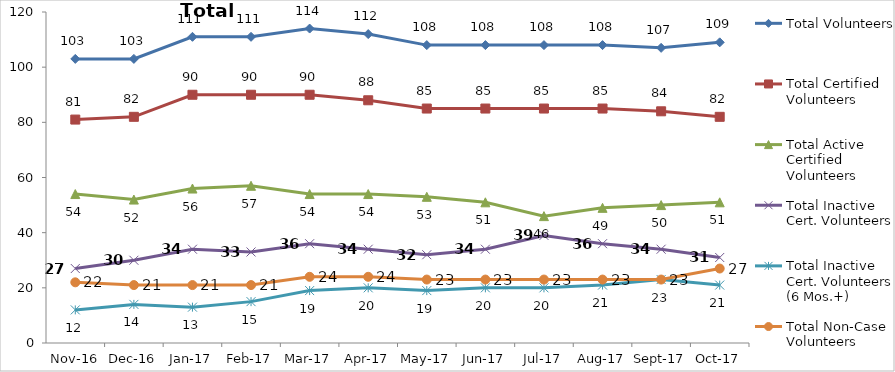
| Category | Total Volunteers | Total Certified Volunteers | Total Active Certified Volunteers | Total Inactive Cert. Volunteers | Total Inactive Cert. Volunteers (6 Mos.+) | Total Non-Case Volunteers |
|---|---|---|---|---|---|---|
| 2016-11-01 | 103 | 81 | 54 | 27 | 12 | 22 |
| 2016-12-01 | 103 | 82 | 52 | 30 | 14 | 21 |
| 2017-01-01 | 111 | 90 | 56 | 34 | 13 | 21 |
| 2017-02-01 | 111 | 90 | 57 | 33 | 15 | 21 |
| 2017-03-01 | 114 | 90 | 54 | 36 | 19 | 24 |
| 2017-04-01 | 112 | 88 | 54 | 34 | 20 | 24 |
| 2017-05-01 | 108 | 85 | 53 | 32 | 19 | 23 |
| 2017-06-01 | 108 | 85 | 51 | 34 | 20 | 23 |
| 2017-07-01 | 108 | 85 | 46 | 39 | 20 | 23 |
| 2017-08-01 | 108 | 85 | 49 | 36 | 21 | 23 |
| 2017-09-01 | 107 | 84 | 50 | 34 | 23 | 23 |
| 2017-10-01 | 109 | 82 | 51 | 31 | 21 | 27 |